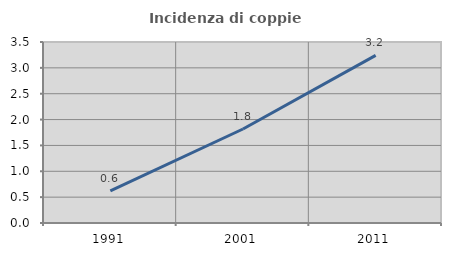
| Category | Incidenza di coppie miste |
|---|---|
| 1991.0 | 0.622 |
| 2001.0 | 1.818 |
| 2011.0 | 3.242 |